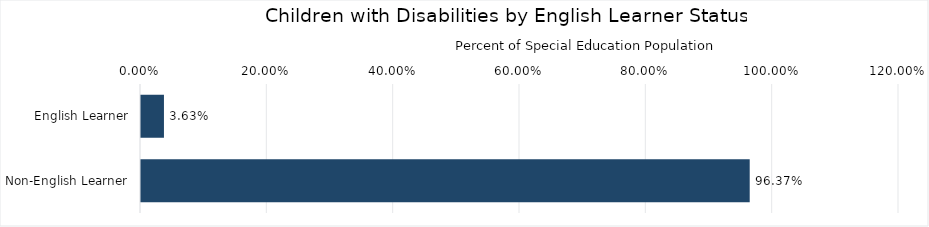
| Category | Percentage |
|---|---|
| English Learner | 0.036 |
| Non-English Learner | 0.964 |